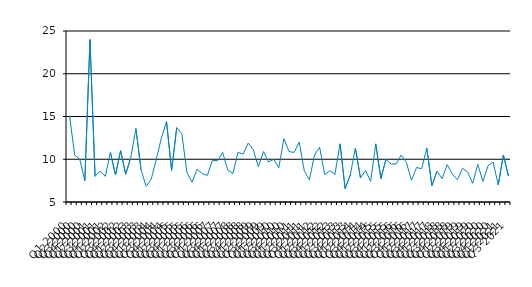
| Category | Series 0 |
|---|---|
| Q1 2000 | 15.1 |
| Q2 2000 | 10.5 |
| Q3 2000 | 10 |
| Q4 2000 | 7.5 |
| Q1 2001 | 24 |
| Q2 2001 | 8 |
| Q3 2001 | 8.62 |
| Q4 2001 | 8 |
| Q1 2002 | 10.8 |
| Q2 2002 | 8.16 |
| Q3 2002 | 11 |
| Q4 2002 | 8.25 |
| Q1 2003 | 10.2 |
| Q2 2003 | 13.6 |
| Q3 2003 | 8.8 |
| Q4 2003 | 6.83 |
| Q1 2004 | 7.66 |
| Q2 2004 | 10 |
| Q3 2004 | 12.5 |
| Q4 2004 | 14.4 |
| Q1 2005 | 8.71 |
| Q2 2005 | 13.7 |
| Q3 2005 | 13 |
| Q4 2005 | 8.44 |
| Q1 2006 | 7.33 |
| Q2 2006 | 8.83 |
| Q3 2006 | 8.33 |
| Q4 2006 | 8.11 |
| Q1 2007 | 9.88 |
| Q2 2007 | 9.82 |
| Q3 2007 | 10.8 |
| Q4 2007 | 8.75 |
| Q1 2008 | 8.33 |
| Q2 2008 | 10.8 |
| Q3 2008 | 10.6 |
| Q4 2008 | 11.9 |
| Q1 2009 | 11.1 |
| Q2 2009 | 9.13 |
| Q3 2009 | 10.9 |
| Q4 2009 | 9.69 |
| Q1 2010 | 10 |
| Q2 2010 | 9 |
| Q3 2010 | 12.4 |
| Q4 2010 | 10.9 |
| Q1 2011 | 10.8 |
| Q2 2011 | 12 |
| Q3 2011 | 8.64 |
| Q4 2011 | 7.6 |
| Q1 2012 | 10.5 |
| Q2 2012 | 11.4 |
| Q3 2012 | 8.2 |
| Q4 2012 | 8.65 |
| Q1 2013 | 8.24 |
| Q2 2013 | 11.8 |
| Q3 2013 | 6.55 |
| Q4 2013 | 8.14 |
| Q1 2014 | 11.3 |
| Q2 2014 | 7.83 |
| Q3 2014 | 8.67 |
| Q4 2014 | 7.42 |
| Q1 2015 | 11.8 |
| Q2 2015 | 7.74 |
| Q3 2015 | 10 |
| Q4 2015 | 9.44 |
| Q1 2016 | 9.45 |
| Q2 2016 | 10.5 |
| Q3 2016 | 9.62 |
| Q4 2016 | 7.54 |
| Q1 2017 | 9.04 |
| Q2 2017 | 8.89 |
| Q3 2017 | 11.3 |
| Q4 2017 | 6.91 |
| Q1 2018 | 8.6 |
| Q2 2018 | 7.74 |
| Q3 2018 | 9.38 |
| Q4 2018 | 8.26 |
| Q1 2019 | 7.6 |
| Q2 2019 | 8.941 |
| Q3 2019 | 8.5 |
| Q4 2019 | 7.19 |
| Q1 2020 | 9.41 |
| Q2 2020 | 7.4 |
| Q3 2020 | 9.25 |
| Q4 2020 | 9.67 |
| Q1 2021 | 7 |
| Q2 2021 | 10.5 |
| Q3 2021 | 8.05 |